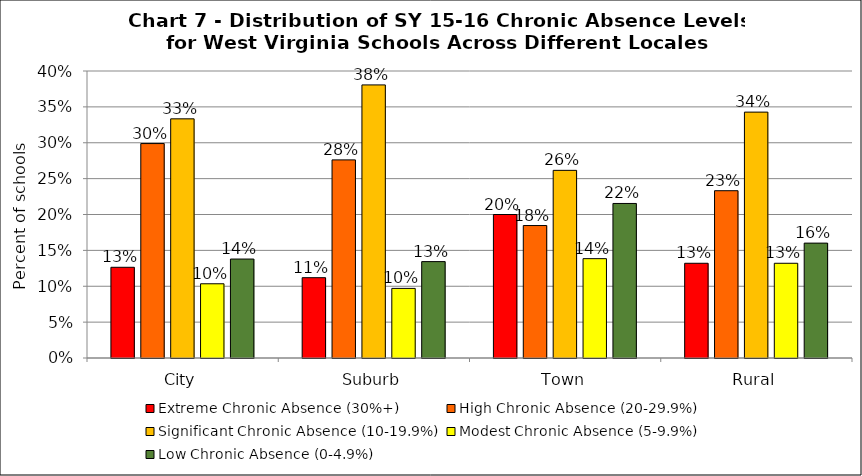
| Category | Extreme Chronic Absence (30%+) | High Chronic Absence (20-29.9%) | Significant Chronic Absence (10-19.9%) | Modest Chronic Absence (5-9.9%) | Low Chronic Absence (0-4.9%) |
|---|---|---|---|---|---|
| 0 | 0.126 | 0.299 | 0.333 | 0.103 | 0.138 |
| 1 | 0.112 | 0.276 | 0.381 | 0.097 | 0.134 |
| 2 | 0.2 | 0.185 | 0.262 | 0.138 | 0.215 |
| 3 | 0.132 | 0.233 | 0.343 | 0.132 | 0.16 |